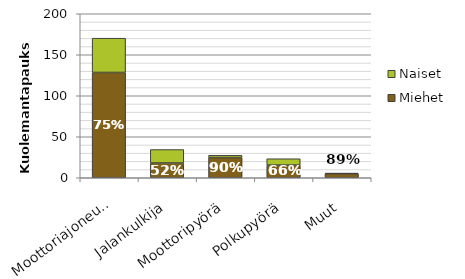
| Category | Miehet | Naiset |
|---|---|---|
| Moottoriajoneuvo | 128.4 | 41.8 |
| Jalankulkija | 18 | 16.4 |
| Moottoripyörä | 24.6 | 2.8 |
| Polkupyörä | 15.4 | 7.8 |
| Muut | 5 | 0.6 |